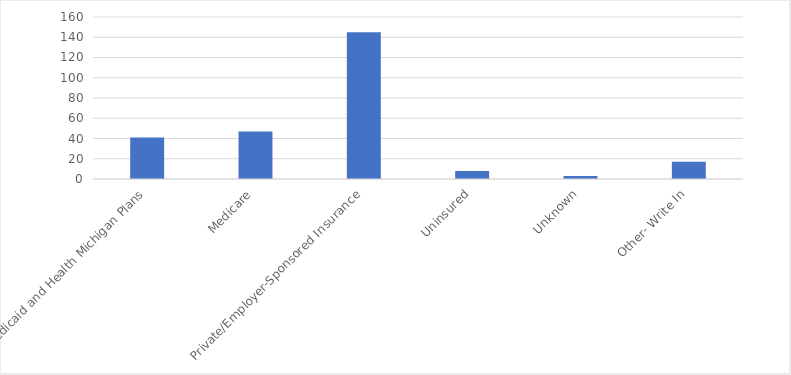
| Category | Number of Responses |
|---|---|
| Medicaid and Health Michigan Plans | 41 |
| Medicare | 47 |
| Private/Employer-Sponsored Insurance | 145 |
| Uninsured | 8 |
| Unknown | 3 |
| Other- Write In | 17 |